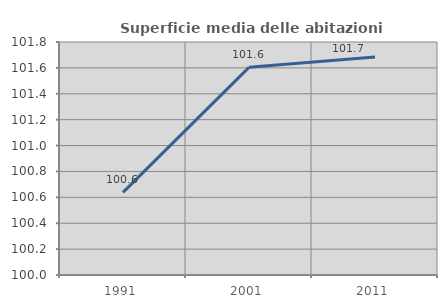
| Category | Superficie media delle abitazioni occupate |
|---|---|
| 1991.0 | 100.639 |
| 2001.0 | 101.604 |
| 2011.0 | 101.685 |